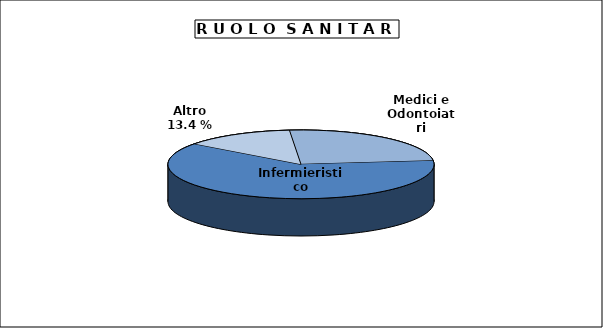
| Category | Medici e Odontoiatri SSN |
|---|---|
| Medici e Odontoiatri | 47506 |
| Infermieristico | 119121 |
| Altro | 25778 |